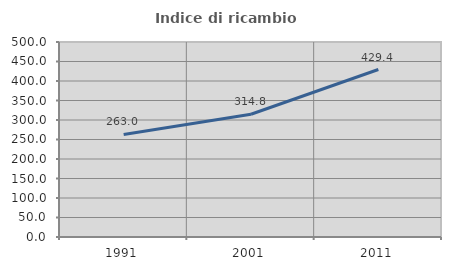
| Category | Indice di ricambio occupazionale  |
|---|---|
| 1991.0 | 262.963 |
| 2001.0 | 314.754 |
| 2011.0 | 429.412 |